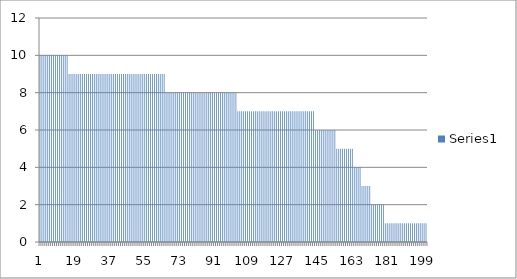
| Category | Series 0 |
|---|---|
| 0 | 10 |
| 1 | 10 |
| 2 | 10 |
| 3 | 10 |
| 4 | 10 |
| 5 | 10 |
| 6 | 10 |
| 7 | 10 |
| 8 | 10 |
| 9 | 10 |
| 10 | 10 |
| 11 | 10 |
| 12 | 10 |
| 13 | 10 |
| 14 | 10 |
| 15 | 9 |
| 16 | 9 |
| 17 | 9 |
| 18 | 9 |
| 19 | 9 |
| 20 | 9 |
| 21 | 9 |
| 22 | 9 |
| 23 | 9 |
| 24 | 9 |
| 25 | 9 |
| 26 | 9 |
| 27 | 9 |
| 28 | 9 |
| 29 | 9 |
| 30 | 9 |
| 31 | 9 |
| 32 | 9 |
| 33 | 9 |
| 34 | 9 |
| 35 | 9 |
| 36 | 9 |
| 37 | 9 |
| 38 | 9 |
| 39 | 9 |
| 40 | 9 |
| 41 | 9 |
| 42 | 9 |
| 43 | 9 |
| 44 | 9 |
| 45 | 9 |
| 46 | 9 |
| 47 | 9 |
| 48 | 9 |
| 49 | 9 |
| 50 | 9 |
| 51 | 9 |
| 52 | 9 |
| 53 | 9 |
| 54 | 9 |
| 55 | 9 |
| 56 | 9 |
| 57 | 9 |
| 58 | 9 |
| 59 | 9 |
| 60 | 9 |
| 61 | 9 |
| 62 | 9 |
| 63 | 9 |
| 64 | 9 |
| 65 | 8 |
| 66 | 8 |
| 67 | 8 |
| 68 | 8 |
| 69 | 8 |
| 70 | 8 |
| 71 | 8 |
| 72 | 8 |
| 73 | 8 |
| 74 | 8 |
| 75 | 8 |
| 76 | 8 |
| 77 | 8 |
| 78 | 8 |
| 79 | 8 |
| 80 | 8 |
| 81 | 8 |
| 82 | 8 |
| 83 | 8 |
| 84 | 8 |
| 85 | 8 |
| 86 | 8 |
| 87 | 8 |
| 88 | 8 |
| 89 | 8 |
| 90 | 8 |
| 91 | 8 |
| 92 | 8 |
| 93 | 8 |
| 94 | 8 |
| 95 | 8 |
| 96 | 8 |
| 97 | 8 |
| 98 | 8 |
| 99 | 8 |
| 100 | 8 |
| 101 | 8 |
| 102 | 7 |
| 103 | 7 |
| 104 | 7 |
| 105 | 7 |
| 106 | 7 |
| 107 | 7 |
| 108 | 7 |
| 109 | 7 |
| 110 | 7 |
| 111 | 7 |
| 112 | 7 |
| 113 | 7 |
| 114 | 7 |
| 115 | 7 |
| 116 | 7 |
| 117 | 7 |
| 118 | 7 |
| 119 | 7 |
| 120 | 7 |
| 121 | 7 |
| 122 | 7 |
| 123 | 7 |
| 124 | 7 |
| 125 | 7 |
| 126 | 7 |
| 127 | 7 |
| 128 | 7 |
| 129 | 7 |
| 130 | 7 |
| 131 | 7 |
| 132 | 7 |
| 133 | 7 |
| 134 | 7 |
| 135 | 7 |
| 136 | 7 |
| 137 | 7 |
| 138 | 7 |
| 139 | 7 |
| 140 | 7 |
| 141 | 7 |
| 142 | 6 |
| 143 | 6 |
| 144 | 6 |
| 145 | 6 |
| 146 | 6 |
| 147 | 6 |
| 148 | 6 |
| 149 | 6 |
| 150 | 6 |
| 151 | 6 |
| 152 | 6 |
| 153 | 5 |
| 154 | 5 |
| 155 | 5 |
| 156 | 5 |
| 157 | 5 |
| 158 | 5 |
| 159 | 5 |
| 160 | 5 |
| 161 | 5 |
| 162 | 4 |
| 163 | 4 |
| 164 | 4 |
| 165 | 4 |
| 166 | 3 |
| 167 | 3 |
| 168 | 3 |
| 169 | 3 |
| 170 | 3 |
| 171 | 2 |
| 172 | 2 |
| 173 | 2 |
| 174 | 2 |
| 175 | 2 |
| 176 | 2 |
| 177 | 2 |
| 178 | 1 |
| 179 | 1 |
| 180 | 1 |
| 181 | 1 |
| 182 | 1 |
| 183 | 1 |
| 184 | 1 |
| 185 | 1 |
| 186 | 1 |
| 187 | 1 |
| 188 | 1 |
| 189 | 1 |
| 190 | 1 |
| 191 | 1 |
| 192 | 1 |
| 193 | 1 |
| 194 | 1 |
| 195 | 1 |
| 196 | 1 |
| 197 | 1 |
| 198 | 1 |
| 199 | 1 |